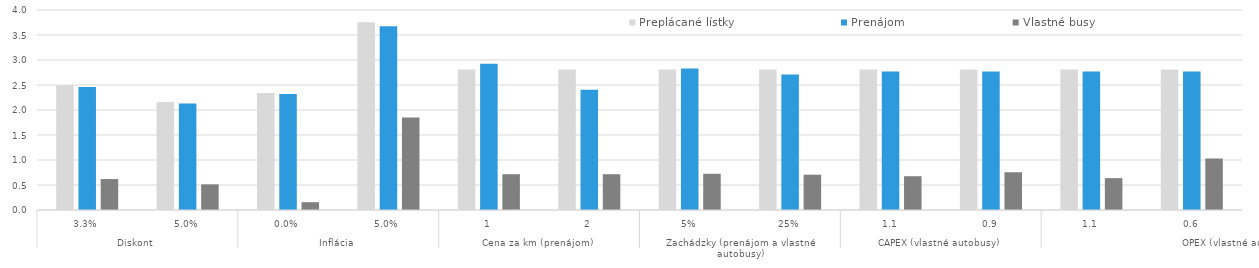
| Category | Preplácané lístky | Prenájom | Vlastné busy |
|---|---|---|---|
| 0 | 2494701.364 | 2460017.917 | 618811.674 |
| 1 | 2158493.885 | 2128458.019 | 513025.246 |
| 2 | 2339397.963 | 2317883.514 | 156320.538 |
| 3 | 3755019.522 | 3676436.975 | 1847975.462 |
| 4 | 2808117.855 | 2924657.175 | 715572.375 |
| 5 | 2808117.855 | 2406139.524 | 715572.375 |
| 6 | 2808117.855 | 2827716.919 | 724771.011 |
| 7 | 2808117.855 | 2710486.841 | 706373.739 |
| 8 | 2808117.855 | 2769101.88 | 676272.375 |
| 9 | 2808117.855 | 2769101.88 | 754872.375 |
| 10 | 2808117.855 | 2769101.88 | 636980.084 |
| 11 | 2808117.855 | 2769101.88 | 1029941.54 |